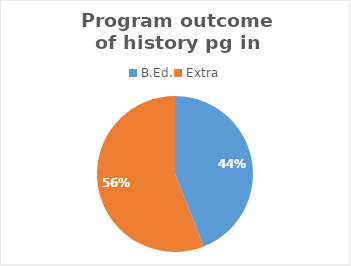
| Category | Series 0 |
|---|---|
| B.Ed. | 11 |
| Extra | 14 |